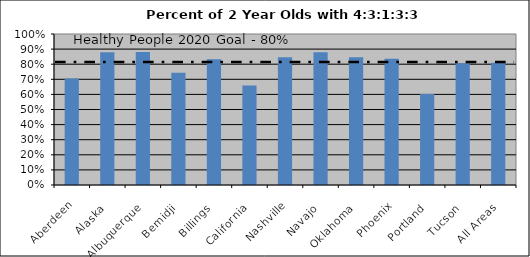
| Category | Percent with 4:3:1:3:3 |
|---|---|
| Aberdeen | 0.706 |
| Alaska | 0.88 |
| Albuquerque | 0.882 |
| Bemidji | 0.744 |
| Billings | 0.832 |
| California | 0.659 |
| Nashville | 0.845 |
| Navajo | 0.879 |
| Oklahoma | 0.846 |
| Phoenix | 0.836 |
| Portland | 0.602 |
| Tucson | 0.807 |
| All Areas | 0.809 |